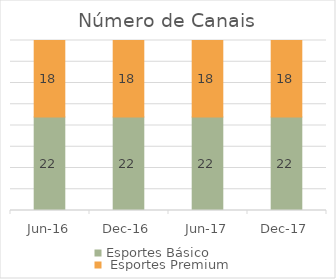
| Category | Esportes Básico |  Esportes Premium |
|---|---|---|
| 2016-06-01 | 22 | 18 |
| 2016-12-01 | 22 | 18 |
| 2017-06-01 | 22 | 18 |
| 2017-12-01 | 22 | 18 |